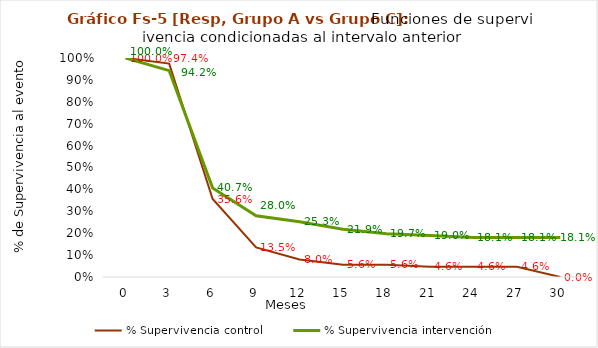
| Category | % Supervivencia control | % Supervivencia intervención |
|---|---|---|
| 0.0 | 1 | 1 |
| 3.0 | 0.974 | 0.942 |
| 6.0 | 0.356 | 0.407 |
| 9.0 | 0.135 | 0.28 |
| 12.0 | 0.08 | 0.253 |
| 15.0 | 0.056 | 0.219 |
| 18.0 | 0.056 | 0.197 |
| 21.0 | 0.046 | 0.19 |
| 24.0 | 0.046 | 0.181 |
| 27.0 | 0.046 | 0.181 |
| 30.0 | 0 | 0.181 |